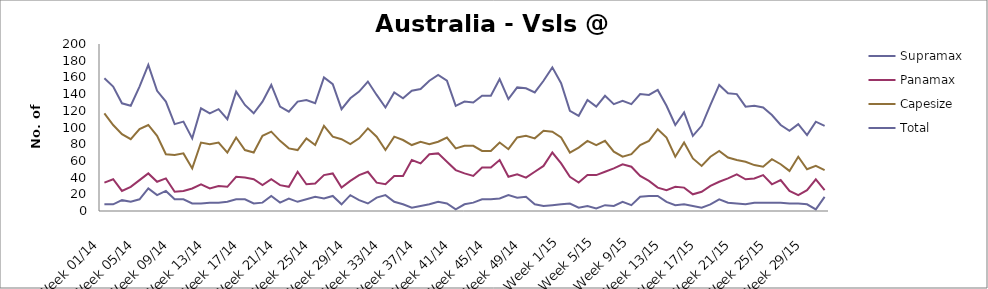
| Category | Supramax | Panamax | Capesize | Total |
|---|---|---|---|---|
| Week 01/14 | 8 | 34 | 117 | 159 |
| Week 02/14 | 8 | 38 | 103 | 149 |
| Week 03/14 | 13 | 24 | 92 | 129 |
| Week 04/14 | 11 | 29 | 86 | 126 |
| Week 05/14 | 14 | 37 | 98 | 149 |
| Week 06/14 | 27 | 45 | 103 | 175 |
| Week 07/14 | 19 | 35 | 90 | 144 |
| Week 08/14 | 24 | 39 | 68 | 131 |
| Week 09/14 | 14 | 23 | 67 | 104 |
| Week 10/14 | 14 | 24 | 69 | 107 |
| Week 11/14 | 9 | 27 | 51 | 87 |
| Week 12/14 | 9 | 32 | 82 | 123 |
| Week 13/14 | 10 | 27 | 80 | 117 |
| Week 14/14 | 10 | 30 | 82 | 122 |
| Week 15/14 | 11 | 29 | 70 | 110 |
| Week 16/14 | 14 | 41 | 88 | 143 |
| Week 17/14 | 14 | 40 | 73 | 127 |
| Week 18/14 | 9 | 38 | 70 | 117 |
| Week 19/14 | 10 | 31 | 90 | 131 |
| Week 20/14 | 18 | 38 | 95 | 151 |
| Week 21/14 | 10 | 31 | 84 | 125 |
| Week 22/14 | 15 | 29 | 75 | 119 |
| Week 23/14 | 11 | 47 | 73 | 131 |
| Week 24/14 | 14 | 32 | 87 | 133 |
| Week 25/14 | 17 | 33 | 79 | 129 |
| Week 26/14 | 15 | 43 | 102 | 160 |
| Week 27/14 | 18 | 45 | 89 | 152 |
| Week 28/14 | 8 | 28 | 86 | 122 |
| Week 29/14 | 19 | 36 | 80 | 135 |
| Week 30/14 | 13 | 43 | 87 | 143 |
| Week 31/14 | 9 | 47 | 99 | 155 |
| Week 32/14 | 16 | 34 | 89 | 139 |
| Week 33/14 | 19 | 32 | 73 | 124 |
| Week 34/14 | 11 | 42 | 89 | 142 |
| Week 35/14 | 8 | 42 | 85 | 135 |
| Week 36/14 | 4 | 61 | 79 | 144 |
| Week 37/14 | 6 | 57 | 83 | 146 |
| Week 38/14 | 8 | 68 | 80 | 156 |
| Week 39/14 | 11 | 69 | 83 | 163 |
| Week 40/14 | 9 | 59 | 88 | 156 |
| Week 41/14 | 2 | 49 | 75 | 126 |
| Week 42/14 | 8 | 45 | 78 | 131 |
| Week 43/14 | 10 | 42 | 78 | 130 |
| Week 44/14 | 14 | 52 | 72 | 138 |
| Week 45/14 | 14 | 52 | 72 | 138 |
| Week 46/14 | 15 | 61 | 82 | 158 |
| Week 47/14 | 19 | 41 | 74 | 134 |
| Week 48/14 | 16 | 44 | 88 | 148 |
| Week 49/14 | 17 | 40 | 90 | 147 |
| Week 50/14 | 8 | 47 | 87 | 142 |
| Week 51/14 | 6 | 54 | 96 | 156 |
| Week 52/14 | 7 | 70 | 95 | 172 |
| Week 1/15 | 8 | 57 | 88 | 153 |
| Week 2/15 | 9 | 41 | 70 | 120 |
| Week 3/15 | 4 | 34 | 76 | 114 |
| Week 4/15 | 6 | 43 | 84 | 133 |
| Week 5/15 | 3 | 43 | 79 | 125 |
| Week 6/15 | 7 | 47 | 84 | 138 |
| Week 7/15 | 6 | 51 | 71 | 128 |
| Week 8/15 | 11 | 56 | 65 | 132 |
| Week 9/15 | 7 | 53 | 68 | 128 |
| Week 10/15 | 17 | 42 | 79 | 140 |
| Week 11/15 | 18 | 36 | 84 | 139 |
| Week 12/15 | 18 | 28 | 98 | 145 |
| Week 13/15 | 11 | 25 | 88 | 126 |
| Week 14/15 | 7 | 29 | 65 | 103 |
| Week 15/15 | 8 | 28 | 82 | 118 |
| Week 16/15 | 6 | 20 | 63 | 90 |
| Week 17/15 | 4 | 23 | 54 | 102 |
| Week 18/15 | 8 | 30 | 65 | 127 |
| Week 19/15 | 14 | 35 | 72 | 151 |
| Week 20/15 | 10 | 39 | 64 | 141 |
| Week 21/15 | 9 | 44 | 61 | 140 |
| Week 22/15 | 8 | 38 | 59 | 125 |
| Week 23/15 | 10 | 39 | 55 | 126 |
| Week 24/15 | 10 | 43 | 53 | 124 |
| Week 25/15 | 10 | 32 | 62 | 115 |
| Week 26/15 | 10 | 37 | 56 | 103 |
| Week 27/15 | 9 | 24 | 48 | 96 |
| Week 28/15 | 9 | 19 | 65 | 104 |
| Week 29/15 | 8 | 25 | 50 | 91 |
| Week 30/15 | 2 | 38 | 54 | 107 |
| Week 31/15 | 17 | 25 | 49 | 102 |